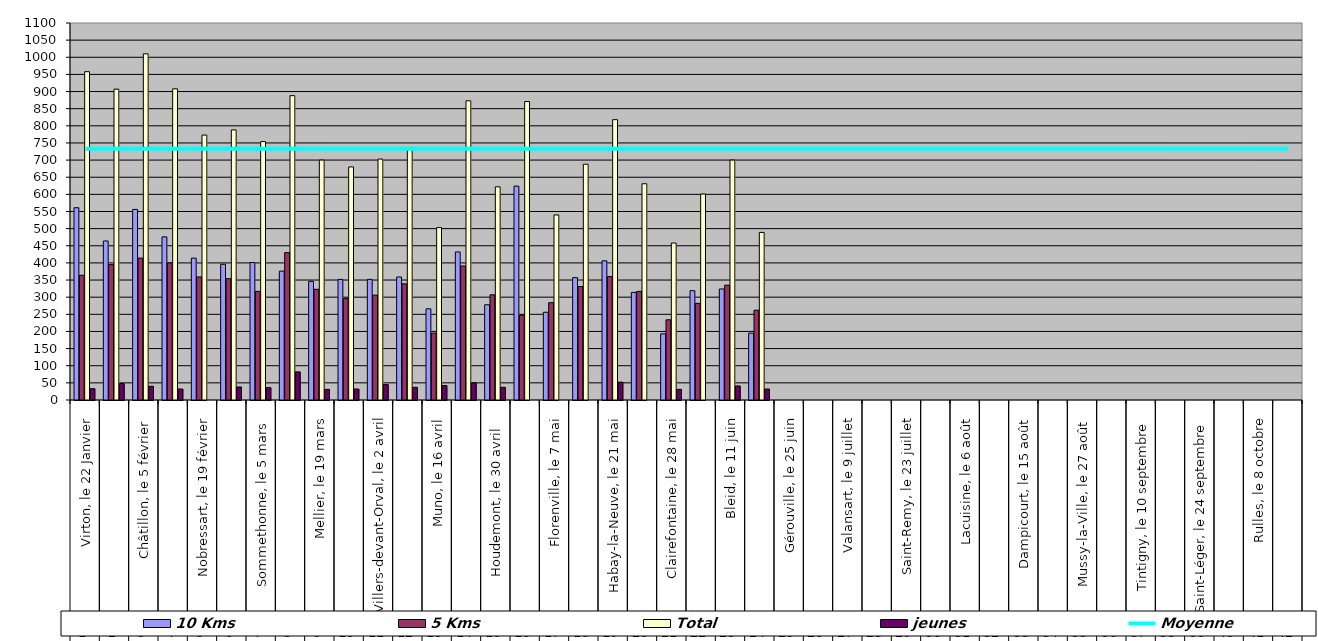
| Category | 10 Kms | 5 Kms | Total | jeunes |
|---|---|---|---|---|
| 0 | 561 | 364 | 958 | 33 |
| 1 | 464 | 395 | 907 | 48 |
| 2 | 556 | 414 | 1010 | 40 |
| 3 | 476 | 400 | 908 | 32 |
| 4 | 414 | 359 | 773 | 0 |
| 5 | 396 | 354 | 788 | 38 |
| 6 | 401 | 317 | 754 | 36 |
| 7 | 376 | 430 | 888 | 82 |
| 8 | 346 | 323 | 700 | 31 |
| 9 | 352 | 296 | 680 | 32 |
| 10 | 352 | 306 | 703 | 45 |
| 11 | 359 | 339 | 735 | 37 |
| 12 | 266 | 195 | 503 | 42 |
| 13 | 432 | 391 | 873 | 50 |
| 14 | 278 | 307 | 622 | 37 |
| 15 | 624 | 247 | 871 | 0 |
| 16 | 256 | 284 | 540 | 0 |
| 17 | 357 | 331 | 688 | 0 |
| 18 | 406 | 360 | 818 | 52 |
| 19 | 314 | 317 | 631 | 0 |
| 20 | 193 | 234 | 458 | 31 |
| 21 | 319 | 282 | 601 | 0 |
| 22 | 324 | 335 | 700 | 41 |
| 23 | 195 | 262 | 489 | 32 |
| 24 | 0 | 0 | 0 | 0 |
| 25 | 0 | 0 | 0 | 0 |
| 26 | 0 | 0 | 0 | 0 |
| 27 | 0 | 0 | 0 | 0 |
| 28 | 0 | 0 | 0 | 0 |
| 29 | 0 | 0 | 0 | 0 |
| 30 | 0 | 0 | 0 | 0 |
| 31 | 0 | 0 | 0 | 0 |
| 32 | 0 | 0 | 0 | 0 |
| 33 | 0 | 0 | 0 | 0 |
| 34 | 0 | 0 | 0 | 0 |
| 35 | 0 | 0 | 0 | 0 |
| 36 | 0 | 0 | 0 | 0 |
| 37 | 0 | 0 | 0 | 0 |
| 38 | 0 | 0 | 0 | 0 |
| 39 | 0 | 0 | 0 | 0 |
| 40 | 0 | 0 | 0 | 0 |
| 41 | 0 | 0 | 0 | 0 |